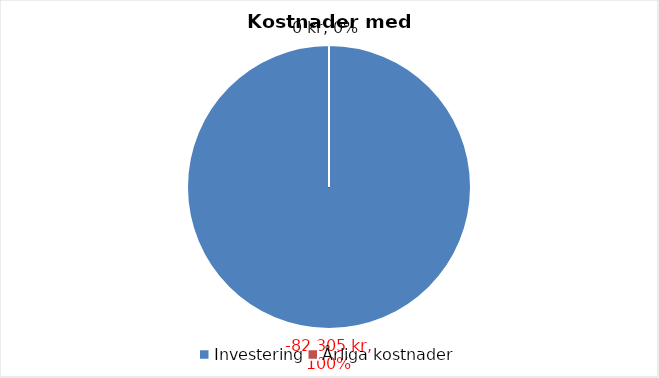
| Category | Series 1 | Series 0 |
|---|---|---|
| Investering | -82305.221 | -89145.221 |
| Årliga kostnader | 0 | 0 |